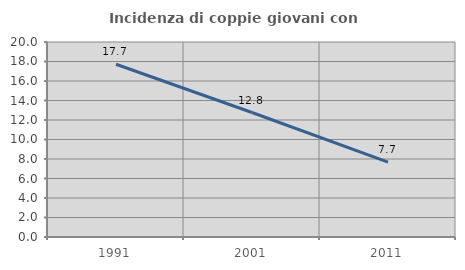
| Category | Incidenza di coppie giovani con figli |
|---|---|
| 1991.0 | 17.721 |
| 2001.0 | 12.767 |
| 2011.0 | 7.681 |